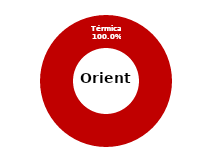
| Category | Oriente |
|---|---|
| Eólica | 0 |
| Hidráulica | 0 |
| Solar | 0 |
| Térmica | 39.648 |